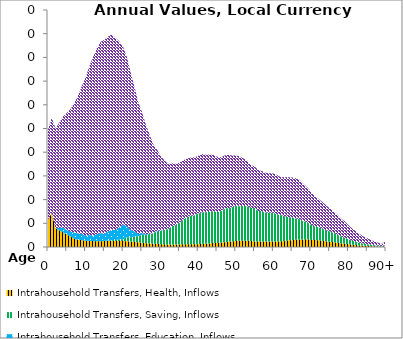
| Category | Intrahousehold Transfers, Health, Inflows | Intrahousehold Transfers, Saving, Inflows | Intrahousehold Transfers, Education, Inflows | Intrahousehold Transfers, Consumption other than health and education, Inflows |
|---|---|---|---|---|
| 0 | 5.686 | 0 | 0 | 19.074 |
|  | 7.177 | 0 | 0 | 20.057 |
| 2 | 3.965 | 0 | 0 | 21.107 |
| 3 | 3.514 | 0 | 0.497 | 22.233 |
| 4 | 3.078 | 0 | 1.016 | 23.436 |
| 5 | 2.651 | 0 | 0.93 | 24.718 |
| 6 | 2.224 | 0 | 1.018 | 25.893 |
| 7 | 1.718 | 0 | 1.318 | 27.366 |
| 8 | 1.546 | 0 | 1.295 | 29.104 |
| 9 | 1.452 | 0 | 1.333 | 31.172 |
| 10 | 1.321 | 0 | 1.075 | 33.359 |
| 11 | 1.292 | 0 | 1.255 | 35.615 |
| 12 | 1.241 | 0 | 1.141 | 37.733 |
| 13 | 1.199 | 0 | 1.501 | 39.229 |
| 14 | 1.203 | 0 | 1.729 | 40.33 |
| 15 | 1.263 | 0.027 | 1.484 | 40.943 |
| 16 | 1.263 | 0.1 | 1.896 | 41.166 |
| 17 | 1.266 | 0.173 | 2.213 | 41.184 |
| 18 | 1.254 | 0.229 | 2.107 | 40.512 |
| 19 | 1.29 | 0.295 | 2.544 | 39.244 |
| 20 | 1.258 | 0.398 | 3.117 | 37.448 |
| 21 | 1.223 | 0.807 | 2.357 | 35.703 |
| 22 | 1.142 | 0.899 | 1.528 | 33.279 |
| 23 | 1.076 | 1.098 | 1.143 | 30.532 |
| 24 | 0.998 | 1.301 | 0.445 | 27.906 |
| 25 | 0.918 | 1.644 | 0.381 | 25.614 |
| 26 | 0.79 | 1.781 | 0.159 | 23.194 |
| 27 | 0.74 | 1.982 | 0.072 | 21.051 |
| 28 | 0.705 | 2.176 | 0.064 | 18.779 |
| 29 | 0.655 | 2.651 | 0.114 | 17.203 |
| 30 | 0.591 | 2.825 | 0.036 | 15.776 |
| 31 | 0.556 | 3.046 | 0.002 | 14.669 |
| 32 | 0.53 | 3.249 | 0.005 | 13.748 |
| 33 | 0.535 | 3.846 | 0.005 | 13.269 |
| 34 | 0.523 | 4.087 | 0 | 12.959 |
| 35 | 0.549 | 4.51 | 0 | 12.746 |
| 36 | 0.576 | 5.225 | 0 | 12.47 |
| 37 | 0.582 | 5.709 | 0.001 | 12.354 |
| 38 | 0.572 | 5.979 | 0.005 | 12.308 |
| 39 | 0.581 | 6.084 | 0 | 12.263 |
| 40 | 0.604 | 6.463 | 0.003 | 12.151 |
| 41 | 0.647 | 6.663 | 0.002 | 12.304 |
| 42 | 0.699 | 6.63 | 0 | 12.18 |
| 43 | 0.736 | 6.692 | 0.001 | 12.115 |
| 44 | 0.845 | 6.748 | 0 | 11.835 |
| 45 | 0.842 | 6.55 | 0 | 11.658 |
| 46 | 0.932 | 6.607 | 0.001 | 11.375 |
| 47 | 1.006 | 7.087 | 0.002 | 11.22 |
| 48 | 1.115 | 7.1 | 0 | 11.255 |
| 49 | 1.168 | 7.23 | 0 | 10.897 |
| 50 | 1.263 | 7.371 | 0.012 | 10.656 |
| 51 | 1.326 | 7.271 | 0 | 10.54 |
| 52 | 1.346 | 7.308 | 0 | 10.053 |
| 53 | 1.335 | 7.263 | 0 | 9.69 |
| 54 | 1.274 | 6.963 | 0 | 9.067 |
| 55 | 1.165 | 7.054 | 0 | 8.754 |
| 56 | 1.19 | 6.397 | 0 | 8.652 |
| 57 | 1.14 | 6.421 | 0 | 8.444 |
| 58 | 1.152 | 6.106 | 0 | 8.42 |
| 59 | 1.143 | 6.1 | 0 | 8.327 |
| 60 | 1.144 | 6.054 | 0 | 8.318 |
| 61 | 1.17 | 5.777 | 0 | 8.241 |
| 62 | 1.194 | 5.502 | 0.002 | 8.019 |
| 63 | 1.234 | 5.279 | 0 | 8.228 |
| 64 | 1.409 | 4.863 | 0 | 8.454 |
| 65 | 1.436 | 4.828 | 0 | 8.402 |
| 66 | 1.552 | 4.477 | 0 | 8.469 |
| 67 | 1.574 | 4.297 | 0.001 | 8.297 |
| 68 | 1.542 | 3.912 | 0 | 7.881 |
| 69 | 1.653 | 3.583 | 0 | 7.399 |
| 70 | 1.502 | 3.224 | 0.003 | 6.939 |
| 71 | 1.47 | 2.9 | 0 | 6.399 |
| 72 | 1.436 | 2.771 | 0 | 5.961 |
| 73 | 1.3 | 2.6 | 0 | 5.651 |
| 74 | 1.201 | 2.359 | 0 | 5.282 |
| 75 | 1.103 | 2.202 | 0.002 | 4.834 |
| 76 | 1.024 | 2.01 | 0.002 | 4.521 |
| 77 | 0.882 | 1.774 | 0 | 4.184 |
| 78 | 0.778 | 1.428 | 0 | 3.825 |
| 79 | 0.691 | 1.315 | 0 | 3.404 |
| 80 | 0.591 | 1.075 | 0 | 2.968 |
| 81 | 0.498 | 0.829 | 0 | 2.545 |
| 82 | 0.413 | 0.687 | 0 | 2.205 |
| 83 | 0.336 | 0.559 | 0 | 1.854 |
| 84 | 0.268 | 0.447 | 0.001 | 1.496 |
| 85 | 0.226 | 0.376 | 0 | 1.26 |
| 86 | 0.178 | 0.297 | 0 | 1.011 |
| 87 | 0.138 | 0.23 | 0 | 0.793 |
| 88 | 0.104 | 0.173 | 0 | 0.606 |
| 89 | 0.076 | 0.126 | 0 | 0.448 |
| 90+ | 0.156 | 0.26 | 0 | 0.938 |